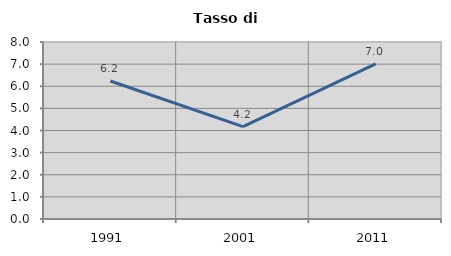
| Category | Tasso di disoccupazione   |
|---|---|
| 1991.0 | 6.237 |
| 2001.0 | 4.172 |
| 2011.0 | 7.015 |